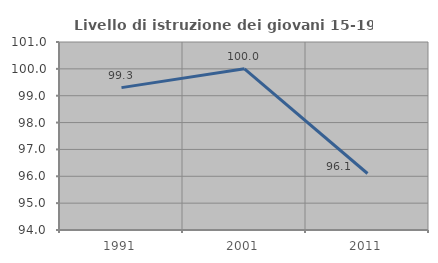
| Category | Livello di istruzione dei giovani 15-19 anni |
|---|---|
| 1991.0 | 99.301 |
| 2001.0 | 100 |
| 2011.0 | 96.104 |